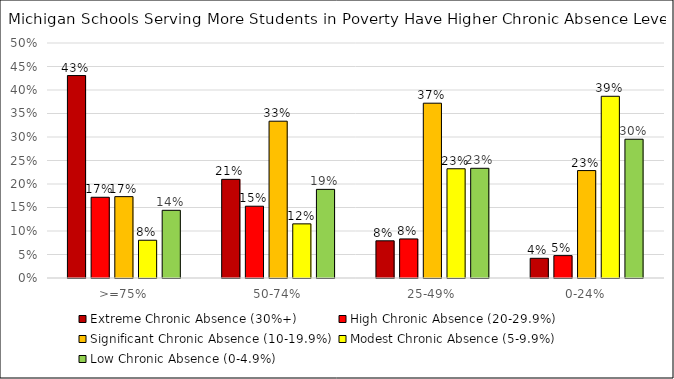
| Category | Extreme Chronic Absence (30%+) | High Chronic Absence (20-29.9%) | Significant Chronic Absence (10-19.9%) | Modest Chronic Absence (5-9.9%) | Low Chronic Absence (0-4.9%) |
|---|---|---|---|---|---|
| >=75% | 0.431 | 0.172 | 0.173 | 0.08 | 0.144 |
| 50-74% | 0.21 | 0.153 | 0.334 | 0.115 | 0.189 |
| 25-49% | 0.079 | 0.083 | 0.372 | 0.232 | 0.233 |
| 0-24% | 0.042 | 0.048 | 0.229 | 0.387 | 0.295 |